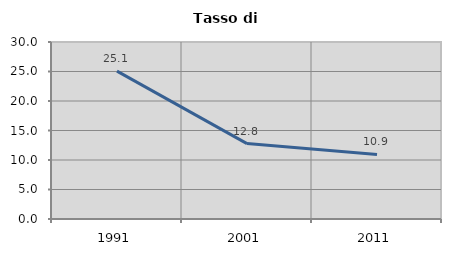
| Category | Tasso di disoccupazione   |
|---|---|
| 1991.0 | 25.054 |
| 2001.0 | 12.78 |
| 2011.0 | 10.932 |